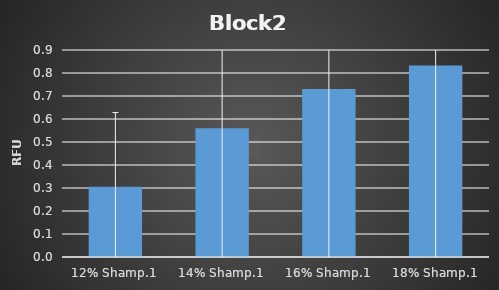
| Category | Block2 |
|---|---|
| 12% Shamp.1 | 0.305 |
| 14% Shamp.1 | 0.56 |
| 16% Shamp.1 | 0.731 |
| 18% Shamp.1 | 0.833 |